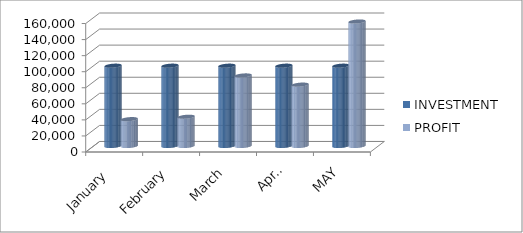
| Category | INVESTMENT  | PROFIT |
|---|---|---|
| January  | 100000 | 33435 |
| February | 100000 | 36400 |
| March | 100000 | 87850 |
| April | 100000 | 76402 |
| MAY | 100000 | 155025 |